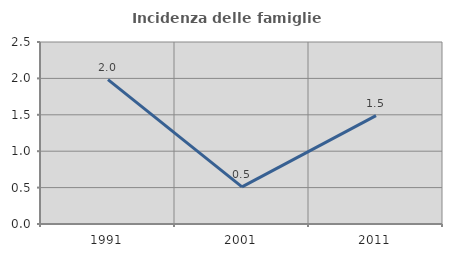
| Category | Incidenza delle famiglie numerose |
|---|---|
| 1991.0 | 1.984 |
| 2001.0 | 0.51 |
| 2011.0 | 1.488 |